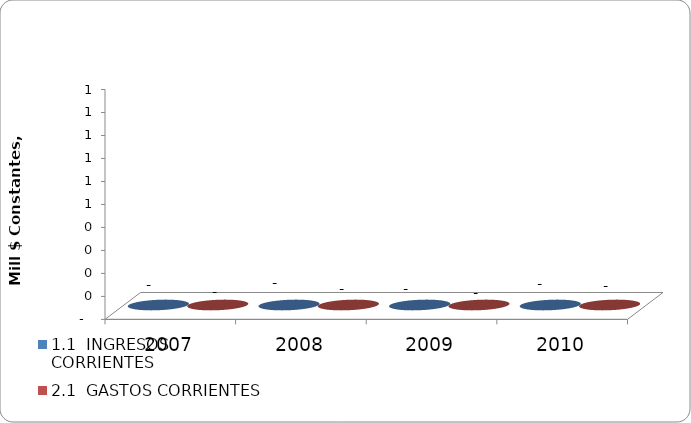
| Category | 1.1  INGRESOS CORRIENTES | 2.1  GASTOS CORRIENTES |
|---|---|---|
| 2007 | 0 | 0 |
| 2008 | 0 | 0 |
| 2009 | 0 | 0 |
| 2010 | 0 | 0 |